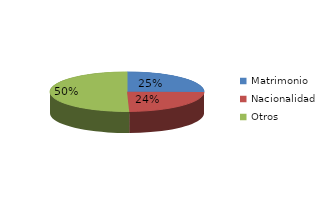
| Category | Series 0 |
|---|---|
| Matrimonio | 3685 |
| Nacionalidad | 3532 |
| Otros | 7349 |